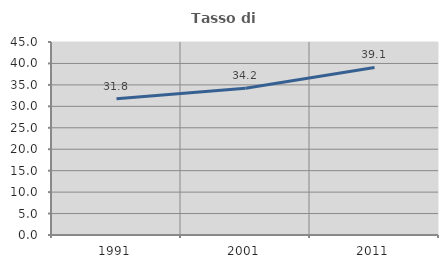
| Category | Tasso di occupazione   |
|---|---|
| 1991.0 | 31.771 |
| 2001.0 | 34.217 |
| 2011.0 | 39.061 |